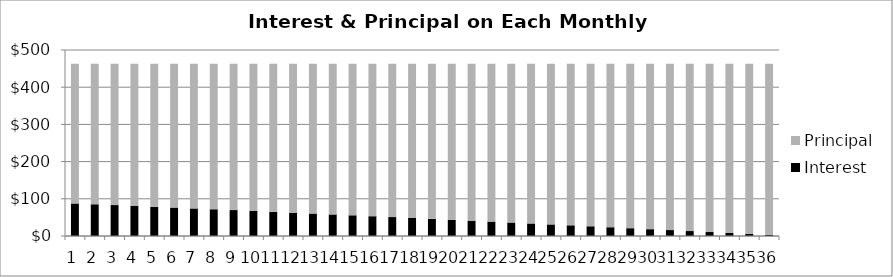
| Category | Interest  | Principal |
|---|---|---|
| 0 | 87.5 | 375.656 |
| 1 | 85.309 | 377.848 |
| 2 | 83.105 | 380.052 |
| 3 | 80.888 | 382.269 |
| 4 | 78.658 | 384.499 |
| 5 | 76.415 | 386.742 |
| 6 | 74.159 | 388.998 |
| 7 | 71.89 | 391.267 |
| 8 | 69.607 | 393.549 |
| 9 | 67.312 | 395.845 |
| 10 | 65.002 | 398.154 |
| 11 | 62.68 | 400.477 |
| 12 | 60.344 | 402.813 |
| 13 | 57.994 | 405.162 |
| 14 | 55.631 | 407.526 |
| 15 | 53.253 | 409.903 |
| 16 | 50.862 | 412.294 |
| 17 | 48.457 | 414.699 |
| 18 | 46.038 | 417.118 |
| 19 | 43.605 | 419.552 |
| 20 | 41.158 | 421.999 |
| 21 | 38.696 | 424.461 |
| 22 | 36.22 | 426.937 |
| 23 | 33.729 | 429.427 |
| 24 | 31.224 | 431.932 |
| 25 | 28.705 | 434.452 |
| 26 | 26.17 | 436.986 |
| 27 | 23.621 | 439.535 |
| 28 | 21.057 | 442.099 |
| 29 | 18.479 | 444.678 |
| 30 | 15.885 | 447.272 |
| 31 | 13.276 | 449.881 |
| 32 | 10.651 | 452.505 |
| 33 | 8.012 | 455.145 |
| 34 | 5.357 | 457.8 |
| 35 | 2.686 | 460.47 |